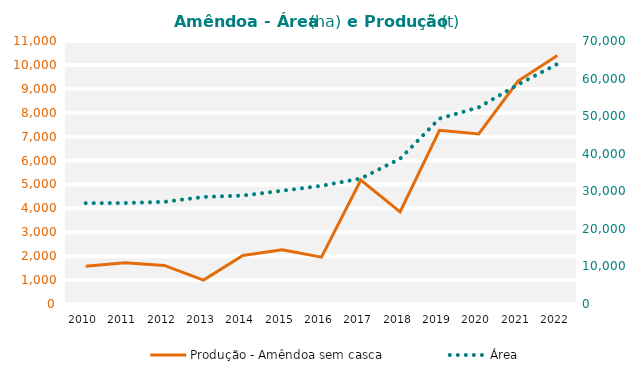
| Category | Produção - Amêndoa sem casca |
|---|---|
| 2010 | 1577.7 |
| 2011 | 1728 |
| 2012 | 1615.05 |
| 2013 | 1000.35 |
| 2014 | 2032.425 |
| 2015 | 2270.25 |
| 2016 | 1960.425 |
| 2017 | 5187.15 |
| 2018 | 3851.775 |
| 2019 | 7267.275 |
| 2020 | 7112.25 |
| 2021 | 9326.7 |
| 2022 | 10398.375 |